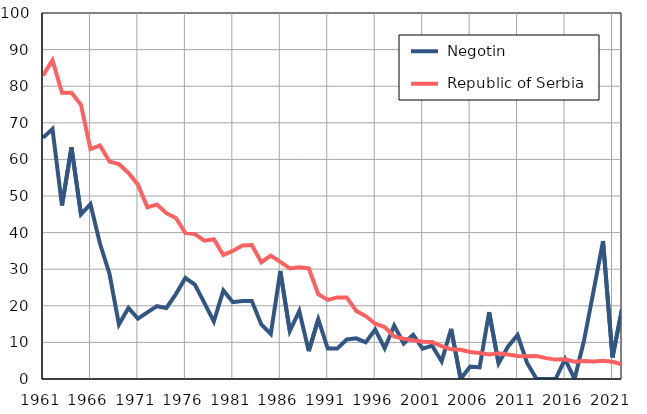
| Category |  Negotin |  Republic of Serbia |
|---|---|---|
| 1961.0 | 65.9 | 82.9 |
| 1962.0 | 68.3 | 87.1 |
| 1963.0 | 47.4 | 78.2 |
| 1964.0 | 63.3 | 78.2 |
| 1965.0 | 45 | 74.9 |
| 1966.0 | 47.8 | 62.8 |
| 1967.0 | 37 | 63.8 |
| 1968.0 | 28.8 | 59.4 |
| 1969.0 | 14.9 | 58.7 |
| 1970.0 | 19.4 | 56.3 |
| 1971.0 | 16.5 | 53.1 |
| 1972.0 | 18.2 | 46.9 |
| 1973.0 | 19.9 | 47.7 |
| 1974.0 | 19.4 | 45.3 |
| 1975.0 | 23.2 | 44 |
| 1976.0 | 27.6 | 39.9 |
| 1977.0 | 25.8 | 39.6 |
| 1978.0 | 20.8 | 37.8 |
| 1979.0 | 15.7 | 38.2 |
| 1980.0 | 24.2 | 33.9 |
| 1981.0 | 21 | 35 |
| 1982.0 | 21.3 | 36.5 |
| 1983.0 | 21.3 | 36.6 |
| 1984.0 | 14.9 | 31.9 |
| 1985.0 | 12.3 | 33.7 |
| 1986.0 | 29.5 | 32 |
| 1987.0 | 13.1 | 30.2 |
| 1988.0 | 18.6 | 30.5 |
| 1989.0 | 7.6 | 30.2 |
| 1990.0 | 16.3 | 23.2 |
| 1991.0 | 8.3 | 21.6 |
| 1992.0 | 8.3 | 22.3 |
| 1993.0 | 10.8 | 22.3 |
| 1994.0 | 11.1 | 18.6 |
| 1995.0 | 10 | 17.2 |
| 1996.0 | 13.5 | 15.1 |
| 1997.0 | 8.4 | 14.2 |
| 1998.0 | 14.6 | 11.6 |
| 1999.0 | 9.7 | 11 |
| 2000.0 | 12.1 | 10.6 |
| 2001.0 | 8.3 | 10.2 |
| 2002.0 | 9.1 | 10.1 |
| 2003.0 | 4.8 | 9 |
| 2004.0 | 13.7 | 8.1 |
| 2005.0 | 0 | 8 |
| 2006.0 | 3.4 | 7.4 |
| 2007.0 | 3.2 | 7.1 |
| 2008.0 | 18.3 | 6.7 |
| 2009.0 | 4.3 | 7 |
| 2010.0 | 8.9 | 6.7 |
| 2011.0 | 12 | 6.3 |
| 2012.0 | 4.4 | 6.2 |
| 2013.0 | 0 | 6.3 |
| 2014.0 | 0 | 5.7 |
| 2015.0 | 0 | 5.3 |
| 2016.0 | 5.4 | 5.4 |
| 2017.0 | 0 | 4.7 |
| 2018.0 | 10.5 | 4.9 |
| 2019.0 | 24 | 4.8 |
| 2020.0 | 37.7 | 5 |
| 2021.0 | 5.9 | 4.7 |
| 2022.0 | 19.1 | 4 |